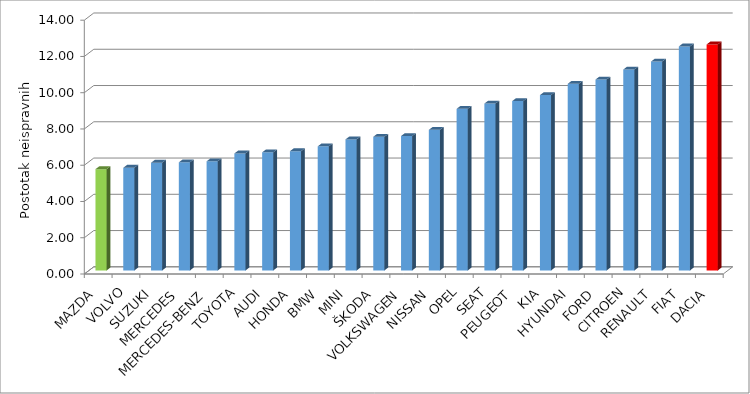
| Category | Series 4 |
|---|---|
| MAZDA | 5.586 |
| VOLVO | 5.664 |
| SUZUKI | 5.942 |
| MERCEDES | 5.962 |
| MERCEDES-BENZ | 6.02 |
| TOYOTA | 6.453 |
| AUDI | 6.513 |
| HONDA | 6.576 |
| BMW | 6.843 |
| MINI | 7.228 |
| ŠKODA | 7.372 |
| VOLKSWAGEN | 7.412 |
| NISSAN | 7.756 |
| OPEL | 8.914 |
| SEAT | 9.206 |
| PEUGEOT | 9.34 |
| KIA | 9.671 |
| HYUNDAI | 10.295 |
| FORD | 10.53 |
| CITROEN | 11.082 |
| RENAULT | 11.522 |
| FIAT | 12.356 |
| DACIA | 12.465 |